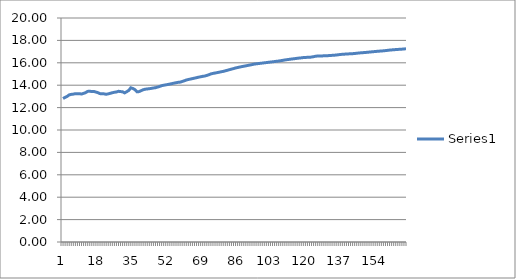
| Category | Series 0 |
|---|---|
| 0 | 12.807 |
| 1 | 12.915 |
| 2 | 13.003 |
| 3 | 13.135 |
| 4 | 13.179 |
| 5 | 13.202 |
| 6 | 13.246 |
| 7 | 13.244 |
| 8 | 13.247 |
| 9 | 13.21 |
| 10 | 13.268 |
| 11 | 13.336 |
| 12 | 13.448 |
| 13 | 13.459 |
| 14 | 13.436 |
| 15 | 13.444 |
| 16 | 13.387 |
| 17 | 13.332 |
| 18 | 13.248 |
| 19 | 13.226 |
| 20 | 13.226 |
| 21 | 13.19 |
| 22 | 13.227 |
| 23 | 13.274 |
| 24 | 13.327 |
| 25 | 13.369 |
| 26 | 13.395 |
| 27 | 13.455 |
| 28 | 13.43 |
| 29 | 13.413 |
| 30 | 13.315 |
| 31 | 13.417 |
| 32 | 13.533 |
| 33 | 13.767 |
| 34 | 13.71 |
| 35 | 13.6 |
| 36 | 13.409 |
| 37 | 13.427 |
| 38 | 13.508 |
| 39 | 13.593 |
| 40 | 13.642 |
| 41 | 13.664 |
| 42 | 13.688 |
| 43 | 13.714 |
| 44 | 13.752 |
| 45 | 13.775 |
| 46 | 13.83 |
| 47 | 13.887 |
| 48 | 13.956 |
| 49 | 13.996 |
| 50 | 14.031 |
| 51 | 14.063 |
| 52 | 14.101 |
| 53 | 14.141 |
| 54 | 14.183 |
| 55 | 14.218 |
| 56 | 14.253 |
| 57 | 14.274 |
| 58 | 14.329 |
| 59 | 14.39 |
| 60 | 14.461 |
| 61 | 14.508 |
| 62 | 14.547 |
| 63 | 14.587 |
| 64 | 14.628 |
| 65 | 14.671 |
| 66 | 14.715 |
| 67 | 14.752 |
| 68 | 14.791 |
| 69 | 14.816 |
| 70 | 14.873 |
| 71 | 14.934 |
| 72 | 15.008 |
| 73 | 15.051 |
| 74 | 15.086 |
| 75 | 15.122 |
| 76 | 15.158 |
| 77 | 15.199 |
| 78 | 15.232 |
| 79 | 15.281 |
| 80 | 15.332 |
| 81 | 15.384 |
| 82 | 15.435 |
| 83 | 15.483 |
| 84 | 15.538 |
| 85 | 15.579 |
| 86 | 15.617 |
| 87 | 15.658 |
| 88 | 15.694 |
| 89 | 15.729 |
| 90 | 15.764 |
| 91 | 15.801 |
| 92 | 15.837 |
| 93 | 15.881 |
| 94 | 15.907 |
| 95 | 15.929 |
| 96 | 15.951 |
| 97 | 15.973 |
| 98 | 15.996 |
| 99 | 16.019 |
| 100 | 16.043 |
| 101 | 16.066 |
| 102 | 16.088 |
| 103 | 16.111 |
| 104 | 16.136 |
| 105 | 16.156 |
| 106 | 16.186 |
| 107 | 16.217 |
| 108 | 16.252 |
| 109 | 16.279 |
| 110 | 16.303 |
| 111 | 16.328 |
| 112 | 16.352 |
| 113 | 16.375 |
| 114 | 16.4 |
| 115 | 16.422 |
| 116 | 16.442 |
| 117 | 16.468 |
| 118 | 16.478 |
| 119 | 16.489 |
| 120 | 16.489 |
| 121 | 16.516 |
| 122 | 16.546 |
| 123 | 16.589 |
| 124 | 16.603 |
| 125 | 16.608 |
| 126 | 16.614 |
| 127 | 16.621 |
| 128 | 16.631 |
| 129 | 16.638 |
| 130 | 16.651 |
| 131 | 16.665 |
| 132 | 16.675 |
| 133 | 16.695 |
| 134 | 16.717 |
| 135 | 16.742 |
| 136 | 16.758 |
| 137 | 16.771 |
| 138 | 16.785 |
| 139 | 16.796 |
| 140 | 16.807 |
| 141 | 16.814 |
| 142 | 16.832 |
| 143 | 16.852 |
| 144 | 16.874 |
| 145 | 16.89 |
| 146 | 16.905 |
| 147 | 16.919 |
| 148 | 16.936 |
| 149 | 16.954 |
| 150 | 16.973 |
| 151 | 16.99 |
| 152 | 17.007 |
| 153 | 17.025 |
| 154 | 17.04 |
| 155 | 17.056 |
| 156 | 17.068 |
| 157 | 17.089 |
| 158 | 17.11 |
| 159 | 17.134 |
| 160 | 17.151 |
| 161 | 17.165 |
| 162 | 17.181 |
| 163 | 17.194 |
| 164 | 17.207 |
| 165 | 17.217 |
| 166 | 17.235 |
| 167 | 17.255 |